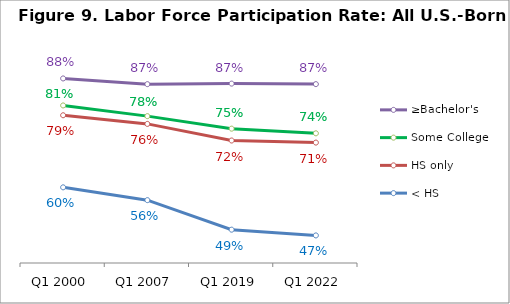
| Category | ≥Bachelor's | Some College | HS only | < HS |
|---|---|---|---|---|
| Q1 2000 | 0.881 | 0.811 | 0.785 | 0.597 |
| Q1 2007 | 0.867 | 0.783 | 0.763 | 0.564 |
| Q1 2019 | 0.868 | 0.75 | 0.72 | 0.487 |
| Q1 2022 | 0.867 | 0.738 | 0.714 | 0.472 |